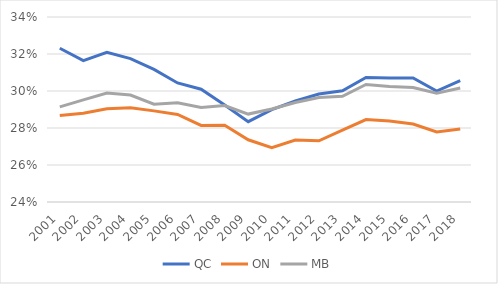
| Category | QC | ON | MB |
|---|---|---|---|
| 2001.0 | 0.323 | 0.287 | 0.291 |
| 2002.0 | 0.316 | 0.288 | 0.295 |
| 2003.0 | 0.321 | 0.29 | 0.299 |
| 2004.0 | 0.317 | 0.291 | 0.298 |
| 2005.0 | 0.312 | 0.289 | 0.293 |
| 2006.0 | 0.304 | 0.287 | 0.294 |
| 2007.0 | 0.301 | 0.281 | 0.291 |
| 2008.0 | 0.292 | 0.281 | 0.292 |
| 2009.0 | 0.283 | 0.274 | 0.288 |
| 2010.0 | 0.29 | 0.269 | 0.29 |
| 2011.0 | 0.295 | 0.273 | 0.294 |
| 2012.0 | 0.298 | 0.273 | 0.296 |
| 2013.0 | 0.3 | 0.279 | 0.297 |
| 2014.0 | 0.307 | 0.285 | 0.304 |
| 2015.0 | 0.307 | 0.284 | 0.302 |
| 2016.0 | 0.307 | 0.282 | 0.302 |
| 2017.0 | 0.3 | 0.278 | 0.299 |
| 2018.0 | 0.306 | 0.279 | 0.302 |